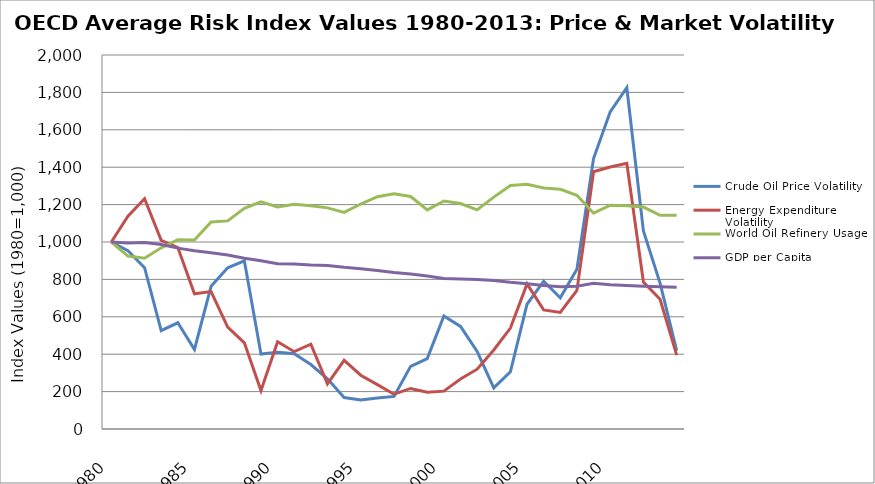
| Category | Crude Oil Price Volatility | Energy Expenditure Volatility | World Oil Refinery Usage | GDP per Capita |
|---|---|---|---|---|
| 1980.0 | 1000 | 1000 | 1000 | 1000 |
| 1981.0 | 953.916 | 1138.325 | 924.872 | 994.077 |
| 1982.0 | 862.398 | 1231.795 | 913.042 | 996.856 |
| 1983.0 | 526.431 | 1008.692 | 968.723 | 987.064 |
| 1984.0 | 567.974 | 970.087 | 1011.541 | 967.324 |
| 1985.0 | 425.535 | 723.009 | 1011.215 | 952.654 |
| 1986.0 | 763.121 | 735.17 | 1107.485 | 942.145 |
| 1987.0 | 861.791 | 545.299 | 1112.935 | 930.028 |
| 1988.0 | 899.666 | 460.921 | 1180.465 | 912.709 |
| 1989.0 | 401.012 | 205.659 | 1214.77 | 899.173 |
| 1990.0 | 410.366 | 466.738 | 1187.619 | 883.865 |
| 1991.0 | 402.585 | 413.551 | 1201.455 | 882.418 |
| 1992.0 | 344.916 | 453.671 | 1193.85 | 877.332 |
| 1993.0 | 268.287 | 241.013 | 1182.488 | 874.87 |
| 1994.0 | 168.252 | 367.083 | 1158.186 | 864.946 |
| 1995.0 | 155.619 | 287.757 | 1203.018 | 857.225 |
| 1996.0 | 166.341 | 237.359 | 1242.172 | 847.859 |
| 1997.0 | 174.477 | 185.933 | 1257.601 | 836.309 |
| 1998.0 | 335.249 | 216.838 | 1243.158 | 828.358 |
| 1999.0 | 376.729 | 196.57 | 1171.976 | 817.878 |
| 2000.0 | 604.661 | 202.439 | 1219.19 | 804.943 |
| 2001.0 | 548.492 | 267.737 | 1205.76 | 802.717 |
| 2002.0 | 414.918 | 319.92 | 1171.557 | 799.384 |
| 2003.0 | 219.555 | 422.751 | 1239.968 | 794.067 |
| 2004.0 | 305.879 | 539.859 | 1301.669 | 784.308 |
| 2005.0 | 667.108 | 775.756 | 1308.377 | 776.629 |
| 2006.0 | 790.236 | 636.812 | 1288.549 | 767.979 |
| 2007.0 | 701.75 | 623.037 | 1282.17 | 760.815 |
| 2008.0 | 854.676 | 740.813 | 1249.987 | 763.09 |
| 2009.0 | 1445.995 | 1375.515 | 1154.197 | 779.798 |
| 2010.0 | 1695.842 | 1401.345 | 1196.566 | 771.154 |
| 2011.0 | 1824.866 | 1421.065 | 1194.29 | 767.035 |
| 2012.0 | 1058.542 | 786.034 | 1186.854 | 763.35 |
| 2013.0 | 780.548 | 693.492 | 1142.715 | 760.79 |
| 2014.0 | 419.492 | 394.983 | 1142.783 | 758.19 |